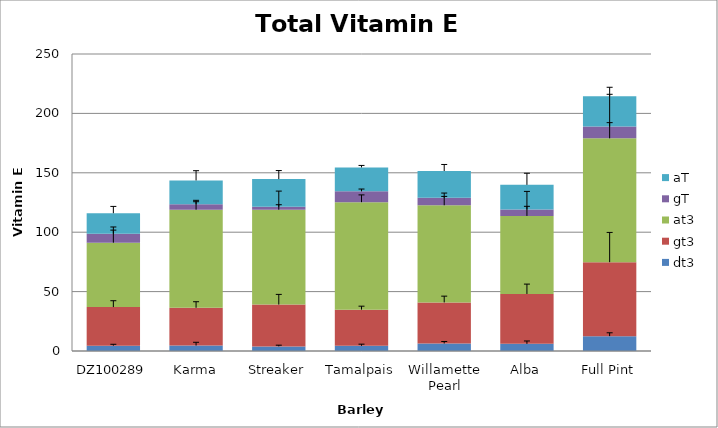
| Category | dt3  | gt3 | at3 | gT | aT |
|---|---|---|---|---|---|
| DZ100289 | 4.499 | 32.481 | 54.173 | 7.537 | 17.298 |
| Karma | 4.595 | 31.759 | 82.625 | 4.524 | 20.059 |
| Streaker | 3.883 | 35.194 | 79.867 | 2.478 | 23.267 |
| Tamalpais | 4.384 | 30.435 | 90.453 | 9.107 | 20.147 |
| Willamette Pearl | 6.327 | 34.539 | 81.786 | 6.342 | 22.517 |
| Alba | 6.019 | 41.989 | 65.705 | 5.469 | 20.664 |
| Full Pint | 12.51 | 62.26 | 104.23 | 9.957 | 25.376 |